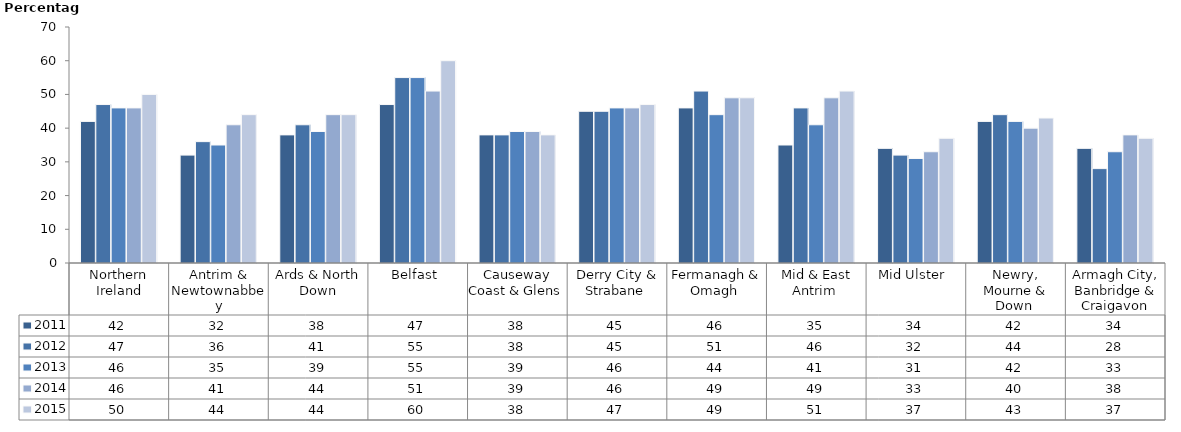
| Category | 2011 | 2012 | 2013 | 2014 | 2015 |
|---|---|---|---|---|---|
| Northern Ireland | 42 | 47 | 46 | 46 | 50 |
| Antrim & Newtownabbey | 32 | 36 | 35 | 41 | 44 |
| Ards & North Down | 38 | 41 | 39 | 44 | 44 |
| Belfast  | 47 | 55 | 55 | 51 | 60 |
| Causeway Coast & Glens  | 38 | 38 | 39 | 39 | 38 |
| Derry City & Strabane  | 45 | 45 | 46 | 46 | 47 |
| Fermanagh & Omagh  | 46 | 51 | 44 | 49 | 49 |
| Mid & East Antrim  | 35 | 46 | 41 | 49 | 51 |
| Mid Ulster  | 34 | 32 | 31 | 33 | 37 |
| Newry, Mourne & Down  | 42 | 44 | 42 | 40 | 43 |
| Armagh City, Banbridge & Craigavon | 34 | 28 | 33 | 38 | 37 |